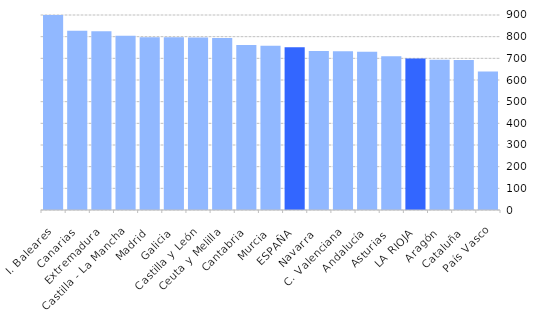
| Category | Series 1 |
|---|---|
| I. Baleares | 921.974 |
| Canarias | 827.064 |
| Extremadura | 824.755 |
| Castilla - La Mancha | 803.81 |
| Madrid | 797.831 |
| Galicia | 796.793 |
| Castilla y León | 796.077 |
| Ceuta y Melilla | 794 |
| Cantabria | 762.04 |
| Murcia | 757.501 |
| ESPAÑA | 750.964 |
| Navarra  | 733.282 |
| C. Valenciana | 732.21 |
| Andalucía | 730.274 |
| Asturias  | 709.664 |
| LA RIOJA | 698.847 |
| Aragón | 692.99 |
| Cataluña | 691.754 |
| País Vasco | 639.363 |